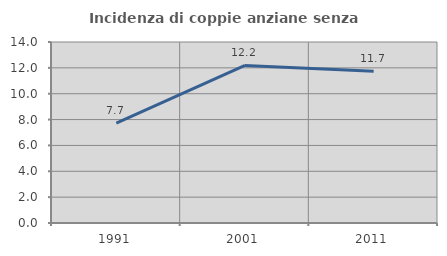
| Category | Incidenza di coppie anziane senza figli  |
|---|---|
| 1991.0 | 7.729 |
| 2001.0 | 12.185 |
| 2011.0 | 11.741 |